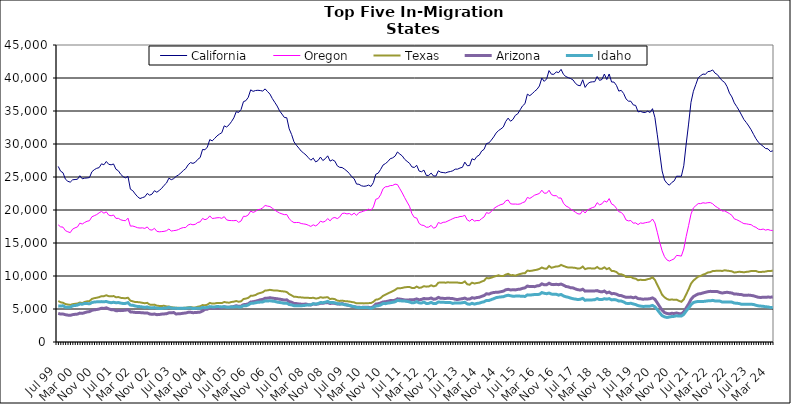
| Category |  California  |  Oregon  |  Texas  |  Arizona  |  Idaho  |
|---|---|---|---|---|---|
| Jul 99 | 26605 | 17749 | 6209 | 4339 | 5471 |
| Aug 99 | 25882 | 17447 | 6022 | 4228 | 5444 |
| Sep 99 | 25644 | 17401 | 5941 | 4237 | 5488 |
| Oct 99 | 24669 | 16875 | 5751 | 4134 | 5279 |
| Nov 99 | 24353 | 16701 | 5680 | 4073 | 5260 |
| Dec 99 | 24218 | 16570 | 5619 | 4042 | 5269 |
| Jan 00 | 24574 | 17109 | 5736 | 4142 | 5485 |
| Feb 00 | 24620 | 17295 | 5789 | 4192 | 5530 |
| Mar 00 | 24655 | 17436 | 5826 | 4226 | 5590 |
| Apr 00 | 25195 | 18009 | 5980 | 4375 | 5748 |
| May 00 | 24730 | 17875 | 5897 | 4337 | 5729 |
| Jun 00 | 24825 | 18113 | 6070 | 4444 | 5853 |
| Jul 00 | 24857 | 18294 | 6163 | 4555 | 5824 |
| Aug 00 | 24913 | 18376 | 6199 | 4603 | 5788 |
| Sep 00 | 25792 | 18971 | 6529 | 4804 | 5976 |
| Oct 00 | 26106 | 19135 | 6643 | 4870 | 6058 |
| Nov 00 | 26315 | 19306 | 6705 | 4926 | 6085 |
| Dec 00 | 26415 | 19570 | 6793 | 4991 | 6096 |
| Jan 01 | 26995 | 19781 | 6942 | 5122 | 6119 |
| Feb 01 | 26851 | 19519 | 6948 | 5089 | 6090 |
| Mar 01 | 27352 | 19720 | 7080 | 5180 | 6143 |
| Apr 01 | 26918 | 19221 | 6943 | 5020 | 6020 |
| May 01 | 26848 | 19126 | 6924 | 4899 | 5950 |
| Jun 01 | 26974 | 19241 | 6959 | 4895 | 6019 |
| Jul 01 | 26172 | 18725 | 6778 | 4737 | 5951 |
| Aug 01 | 25943 | 18736 | 6810 | 4757 | 5973 |
| Sep 01 | 25399 | 18514 | 6688 | 4753 | 5895 |
| Oct 01 | 25050 | 18415 | 6650 | 4780 | 5833 |
| Nov 01 | 24873 | 18381 | 6631 | 4826 | 5850 |
| Dec 01 | 25099 | 18765 | 6708 | 4898 | 5969 |
| Jan 02 | 23158 | 17561 | 6261 | 4560 | 5595 |
| Feb 02 | 22926 | 17573 | 6162 | 4531 | 5560 |
| Mar 02 | 22433 | 17452 | 6052 | 4481 | 5458 |
| Apr 02 | 22012 | 17314 | 6046 | 4458 | 5380 |
| May 02 | 21733 | 17267 | 6007 | 4452 | 5358 |
| Jun 02 | 21876 | 17298 | 5933 | 4444 | 5315 |
| Jul 02 | 21997 | 17209 | 5873 | 4383 | 5243 |
| Aug 02 | 22507 | 17436 | 5929 | 4407 | 5315 |
| Sep 02 | 22244 | 17010 | 5672 | 4248 | 5192 |
| Oct 02 | 22406 | 16952 | 5625 | 4191 | 5167 |
| Nov 02 | 22922 | 17223 | 5663 | 4242 | 5221 |
| Dec 02 | 22693 | 16770 | 5499 | 4142 | 5120 |
| Jan 03 | 22964 | 16694 | 5463 | 4166 | 5089 |
| Feb 03 | 23276 | 16727 | 5461 | 4226 | 5077 |
| Mar 03 | 23736 | 16766 | 5486 | 4251 | 5145 |
| Apr 03 | 24079 | 16859 | 5389 | 4289 | 5145 |
| May 03 | 24821 | 17117 | 5378 | 4415 | 5254 |
| Jun 03 | 24592 | 16812 | 5273 | 4426 | 5135 |
| Jul 03 | 24754 | 16875 | 5226 | 4466 | 5124 |
| Aug 03 | 25092 | 16922 | 5181 | 4244 | 5100 |
| Sep 03 | 25316 | 17036 | 5181 | 4279 | 5086 |
| Oct 03 | 25622 | 17228 | 5139 | 4301 | 5110 |
| Nov 03 | 25984 | 17335 | 5175 | 4362 | 5091 |
| Dec 03 | 26269 | 17350 | 5189 | 4396 | 5113 |
| Jan 04 | 26852 | 17734 | 5255 | 4492 | 5152 |
| Feb 04 | 27184 | 17860 | 5301 | 4502 | 5183 |
| Mar 04 | 27062 | 17757 | 5227 | 4443 | 5056 |
| Apr 04 | 27238 | 17840 | 5227 | 4461 | 5104 |
| May 04 | 27671 | 18113 | 5345 | 4493 | 5095 |
| Jun 04 | 27949 | 18201 | 5416 | 4532 | 5103 |
| Jul 04 | 29172 | 18727 | 5597 | 4697 | 5231 |
| Aug 04 | 29122 | 18529 | 5561 | 4945 | 5197 |
| Sep 04 | 29542 | 18678 | 5656 | 4976 | 5237 |
| Oct 04 | 30674 | 19108 | 5922 | 5188 | 5363 |
| Nov 04 | 30472 | 18716 | 5823 | 5106 | 5321 |
| Dec 04 | 30831 | 18755 | 5838 | 5135 | 5312 |
| Jan 05 | 31224 | 18823 | 5906 | 5155 | 5374 |
| Feb 05 | 31495 | 18842 | 5898 | 5168 | 5357 |
| Mar 05 | 31714 | 18738 | 5894 | 5212 | 5313 |
| Apr 05 | 32750 | 18998 | 6060 | 5340 | 5350 |
| May 05 | 32575 | 18504 | 5989 | 5269 | 5276 |
| Jun 05 | 32898 | 18414 | 5954 | 5252 | 5271 |
| Jul 05 | 33384 | 18395 | 6062 | 5322 | 5322 |
| Aug 05 | 33964 | 18381 | 6113 | 5375 | 5316 |
| Sep 05 | 34897 | 18426 | 6206 | 5493 | 5362 |
| Oct 05 | 34780 | 18132 | 6100 | 5408 | 5308 |
| Nov 05 | 35223 | 18332 | 6162 | 5434 | 5314 |
| Dec 05 | 36415 | 19047 | 6508 | 5658 | 5487 |
| Jan 06 | 36567 | 19032 | 6576 | 5688 | 5480 |
| Feb 06 | 37074 | 19257 | 6692 | 5792 | 5616 |
| Mar 06 | 38207 | 19845 | 6993 | 6052 | 5850 |
| Apr 06 | 37976 | 19637 | 7024 | 6101 | 5864 |
| May 06 | 38099 | 19781 | 7114 | 6178 | 5943 |
| Jun 06 | 38141 | 20061 | 7331 | 6276 | 6018 |
| Jul 06 | 38097 | 20111 | 7431 | 6399 | 6046 |
| Aug 06 | 38021 | 20333 | 7542 | 6450 | 6064 |
| Sep 06 | 38349 | 20686 | 7798 | 6627 | 6232 |
| Oct 06 | 37947 | 20591 | 7825 | 6647 | 6216 |
| Nov 06 | 37565 | 20526 | 7907 | 6707 | 6244 |
| Dec 06 | 36884 | 20272 | 7840 | 6648 | 6192 |
| Jan 07 | 36321 | 19984 | 7789 | 6597 | 6151 |
| Feb 07 | 35752 | 19752 | 7799 | 6554 | 6048 |
| Mar 07 | 35025 | 19547 | 7737 | 6487 | 5989 |
| Apr 07 | 34534 | 19412 | 7685 | 6430 | 5937 |
| May 07 | 34022 | 19296 | 7654 | 6353 | 5858 |
| Jun 07 | 33974 | 19318 | 7577 | 6390 | 5886 |
| Jul 07 | 32298 | 18677 | 7250 | 6117 | 5682 |
| Aug 07 | 31436 | 18322 | 7070 | 6034 | 5617 |
| Sep 07 | 30331 | 18087 | 6853 | 5847 | 5500 |
| Oct 07 | 29813 | 18108 | 6839 | 5821 | 5489 |
| Nov 07 | 29384 | 18105 | 6777 | 5769 | 5481 |
| Dec 07 | 28923 | 17949 | 6760 | 5733 | 5499 |
| Jan 08 | 28627 | 17890 | 6721 | 5732 | 5521 |
| Feb 08 | 28328 | 17834 | 6719 | 5749 | 5579 |
| Mar 08 | 27911 | 17680 | 6690 | 5650 | 5614 |
| Apr 08 | 27543 | 17512 | 6656 | 5612 | 5635 |
| May 08 | 27856 | 17754 | 6705 | 5774 | 5798 |
| Jun 08 | 27287 | 17589 | 6593 | 5717 | 5745 |
| Jul 08 | 27495 | 17834 | 6623 | 5761 | 5807 |
| Aug 08 | 28018 | 18309 | 6789 | 5867 | 5982 |
| Sep-08 | 27491 | 18164 | 6708 | 5864 | 5954 |
| Oct 08 | 27771 | 18291 | 6755 | 5942 | 6032 |
| Nov 08 | 28206 | 18706 | 6787 | 5970 | 6150 |
| Dec 08 | 27408 | 18353 | 6505 | 5832 | 5975 |
| Jan 09 | 27601 | 18778 | 6569 | 5890 | 5995 |
| Feb 09 | 27394 | 18863 | 6483 | 5845 | 5936 |
| Mar 09 | 26690 | 18694 | 6273 | 5751 | 5806 |
| Apr 09 | 26461 | 18943 | 6222 | 5735 | 5777 |
| May 09 | 26435 | 19470 | 6272 | 5819 | 5767 |
| Jun 09 | 26187 | 19522 | 6199 | 5700 | 5649 |
| Jul 09 | 25906 | 19408 | 6171 | 5603 | 5617 |
| Aug 09 | 25525 | 19469 | 6128 | 5533 | 5540 |
| Sep 09 | 25050 | 19249 | 6059 | 5405 | 5437 |
| Oct 09 | 24741 | 19529 | 6004 | 5349 | 5369 |
| Nov 09 | 23928 | 19187 | 5854 | 5271 | 5248 |
| Dec 09 | 23899 | 19607 | 5886 | 5261 | 5195 |
| Jan 10 | 23676 | 19703 | 5881 | 5232 | 5234 |
| Feb 10 | 23592 | 19845 | 5850 | 5272 | 5236 |
| Mar 10 | 23634 | 19946 | 5864 | 5278 | 5219 |
| Apr 10 | 23774 | 20134 | 5889 | 5257 | 5201 |
| May 10 | 23567 | 19966 | 5897 | 5172 | 5105 |
| Jun 10 | 24166 | 20464 | 6087 | 5356 | 5237 |
| Jul 10 | 25410 | 21627 | 6417 | 5742 | 5452 |
| Aug 10 | 25586 | 21744 | 6465 | 5797 | 5491 |
| Sep 10 | 26150 | 22314 | 6667 | 5907 | 5609 |
| Oct 10 | 26807 | 23219 | 6986 | 6070 | 5831 |
| Nov 10 | 27033 | 23520 | 7179 | 6100 | 5810 |
| Dec 10 | 27332 | 23551 | 7361 | 6182 | 5898 |
| Jan 11 | 27769 | 23697 | 7525 | 6276 | 5938 |
| Feb 11 | 27898 | 23718 | 7708 | 6267 | 6016 |
| Mar 11 | 28155 | 23921 | 7890 | 6330 | 6081 |
| Apr 11 | 28790 | 23847 | 8146 | 6544 | 6305 |
| May 11 | 28471 | 23215 | 8131 | 6502 | 6248 |
| Jun 11 | 28191 | 22580 | 8199 | 6445 | 6217 |
| Jul 11 | 27678 | 21867 | 8291 | 6368 | 6202 |
| Aug 11 | 27372 | 21203 | 8321 | 6356 | 6146 |
| Sep 11 | 27082 | 20570 | 8341 | 6387 | 6075 |
| Oct 11 | 26528 | 19442 | 8191 | 6402 | 5932 |
| Nov 11 | 26440 | 18872 | 8176 | 6426 | 5968 |
| Dec 11 | 26770 | 18784 | 8401 | 6533 | 6106 |
| Jan 12 | 25901 | 17963 | 8202 | 6390 | 5933 |
| Feb 12 | 25796 | 17718 | 8266 | 6456 | 5900 |
| Mar 12 | 26042 | 17647 | 8456 | 6600 | 6054 |
| Apr 12 | 25239 | 17386 | 8388 | 6534 | 5838 |
| May 12 | 25238 | 17407 | 8401 | 6558 | 5854 |
| Jun 12 | 25593 | 17673 | 8594 | 6669 | 6009 |
| Jul 12 | 25155 | 17237 | 8432 | 6474 | 5817 |
| Aug 12 | 25146 | 17391 | 8536 | 6539 | 5842 |
| Sep 12 | 25942 | 18102 | 8989 | 6759 | 6061 |
| Oct 12 | 25718 | 17953 | 9012 | 6618 | 6027 |
| Nov 12 | 25677 | 18134 | 9032 | 6611 | 6009 |
| Dec 12 | 25619 | 18166 | 8981 | 6601 | 5999 |
| Jan 13 | 25757 | 18344 | 9051 | 6627 | 5989 |
| Feb-13 | 25830 | 18512 | 9001 | 6606 | 5968 |
| Mar-13 | 25940 | 18689 | 9021 | 6577 | 5853 |
| Apr 13 | 26187 | 18844 | 9013 | 6478 | 5925 |
| May 13 | 26192 | 18884 | 9003 | 6431 | 5924 |
| Jun-13 | 26362 | 19013 | 8948 | 6508 | 5896 |
| Jul 13 | 26467 | 19037 | 8958 | 6559 | 5948 |
| Aug 13 | 27253 | 19198 | 9174 | 6655 | 6020 |
| Sep 13 | 26711 | 18501 | 8747 | 6489 | 5775 |
| Oct 13 | 26733 | 18301 | 8681 | 6511 | 5711 |
| Nov 13 | 27767 | 18620 | 8989 | 6709 | 5860 |
| Dec 13 | 27583 | 18320 | 8863 | 6637 | 5740 |
| Jan 14 | 28107 | 18409 | 8939 | 6735 | 5843 |
| Feb-14 | 28313 | 18383 | 8989 | 6779 | 5893 |
| Mar 14 | 28934 | 18696 | 9160 | 6918 | 6015 |
| Apr 14 | 29192 | 18946 | 9291 | 7036 | 6099 |
| May 14 | 30069 | 19603 | 9701 | 7314 | 6304 |
| Jun 14 | 30163 | 19487 | 9641 | 7252 | 6293 |
| Jul-14 | 30587 | 19754 | 9752 | 7415 | 6427 |
| Aug-14 | 31074 | 20201 | 9882 | 7499 | 6557 |
| Sep 14 | 31656 | 20459 | 9997 | 7536 | 6719 |
| Oct 14 | 32037 | 20663 | 10109 | 7555 | 6786 |
| Nov 14 | 32278 | 20825 | 9992 | 7628 | 6831 |
| Dec 14 | 32578 | 20918 | 10006 | 7705 | 6860 |
| Jan 15 | 33414 | 21396 | 10213 | 7906 | 7000 |
| Feb 15 | 33922 | 21518 | 10337 | 7982 | 7083 |
| Mar 15 | 33447 | 20942 | 10122 | 7891 | 7006 |
| Apr-15 | 33731 | 20893 | 10138 | 7906 | 6931 |
| May 15 | 34343 | 20902 | 10053 | 7895 | 6952 |
| Jun-15 | 34572 | 20870 | 10192 | 7973 | 6966 |
| Jul 15 | 35185 | 20916 | 10303 | 8000 | 6949 |
| Aug 15 | 35780 | 21115 | 10399 | 8126 | 6938 |
| Sep 15 | 36109 | 21246 | 10428 | 8207 | 6896 |
| Oct 15 | 37555 | 21908 | 10813 | 8477 | 7140 |
| Nov 15 | 37319 | 21750 | 10763 | 8390 | 7112 |
| Dec 15 | 37624 | 21990 | 10807 | 8395 | 7149 |
| Jan 16 | 37978 | 22248 | 10892 | 8388 | 7201 |
| Feb 16 | 38285 | 22369 | 10951 | 8508 | 7192 |
| Mar 16 | 38792 | 22506 | 11075 | 8547 | 7226 |
| Apr 16 | 39994 | 22999 | 11286 | 8815 | 7487 |
| May 16 | 39488 | 22548 | 11132 | 8673 | 7382 |
| Jun 16 | 39864 | 22556 | 11100 | 8682 | 7315 |
| Jul 16 | 41123 | 22989 | 11516 | 8903 | 7420 |
| Aug 16 | 40573 | 22333 | 11251 | 8731 | 7261 |
| Sep 16 | 40560 | 22162 | 11340 | 8692 | 7216 |
| Oct 16 | 40923 | 22172 | 11456 | 8742 | 7233 |
| Nov 16 | 40817 | 21818 | 11459 | 8685 | 7101 |
| Dec 16 | 41311 | 21815 | 11681 | 8783 | 7203 |
| Jan 17 | 40543 | 21029 | 11524 | 8609 | 6982 |
| Feb 17 | 40218 | 20613 | 11385 | 8416 | 6852 |
| Mar 17 | 40052 | 20425 | 11276 | 8354 | 6775 |
| Apr 17 | 39913 | 20147 | 11297 | 8218 | 6653 |
| May 17 | 39695 | 19910 | 11265 | 8196 | 6552 |
| Jun 17 | 39177 | 19650 | 11225 | 8034 | 6500 |
| Jul 17 | 38901 | 19419 | 11115 | 7923 | 6429 |
| Aug 17 | 38827 | 19389 | 11168 | 7867 | 6479 |
| Sep 17 | 39736 | 19936 | 11426 | 7991 | 6609 |
| Oct 17 | 38576 | 19547 | 11041 | 7708 | 6315 |
| Nov 17 | 39108 | 20013 | 11158 | 7746 | 6381 |
| Dec 17 | 39359 | 20202 | 11185 | 7743 | 6366 |
| Jan 18 | 39420 | 20362 | 11118 | 7736 | 6380 |
| Feb 18 | 39440 | 20476 | 11128 | 7741 | 6407 |
| Mar 18 | 40218 | 21106 | 11362 | 7789 | 6578 |
| Apr 18 | 39637 | 20788 | 11111 | 7642 | 6423 |
| May 18 | 39777 | 20933 | 11097 | 7591 | 6430 |
| Jun 18 | 40602 | 21381 | 11317 | 7721 | 6554 |
| Jul 18 | 39767 | 21189 | 11038 | 7445 | 6489 |
| Aug 18 | 40608 | 21729 | 11200 | 7560 | 6569 |
| Sep 18 | 39395 | 20916 | 10772 | 7318 | 6383 |
| Oct 18 | 39383 | 20724 | 10740 | 7344 | 6429 |
| Nov 18 | 38891 | 20265 | 10605 | 7255 | 6365 |
| Dec 18 | 38013 | 19741 | 10292 | 7069 | 6205 |
| Jan 19 | 38130 | 19643 | 10261 | 7032 | 6203 |
| Feb 19 | 37658 | 19237 | 10132 | 6892 | 6073 |
| Mar 19 | 36831 | 18492 | 9848 | 6766 | 5863 |
| Apr 19 | 36492 | 18349 | 9839 | 6763 | 5827 |
| May 19 | 36481 | 18407 | 9867 | 6809 | 5873 |
| Jun 19 | 35925 | 17998 | 9661 | 6698 | 5761 |
| Jul 19 | 35843 | 18049 | 9598 | 6800 | 5673 |
| Aug 19 | 34870 | 17785 | 9361 | 6577 | 5512 |
| Sep 19 | 34945 | 18038 | 9428 | 6547 | 5437 |
| Oct 19 | 34802 | 17977 | 9385 | 6483 | 5390 |
| Nov 19 | 34775 | 18072 | 9403 | 6511 | 5401 |
| Dec 19 | 34976 | 18140 | 9518 | 6521 | 5419 |
| Jan 20 | 34774 | 18209 | 9594 | 6561 | 5434 |
| Feb 20 | 35352 | 18632 | 9804 | 6682 | 5543 |
| Mar 20 | 34013 | 18041 | 9411 | 6464 | 5330 |
| Apr 20 | 31385 | 16629 | 8666 | 5922 | 4906 |
| May 20 | 28657 | 15123 | 7927 | 5355 | 4419 |
| Jun 20 | 25915 | 13817 | 7164 | 4815 | 3992 |
| Jul 20 | 24545 | 12926 | 6776 | 4457 | 3810 |
| Aug 20 | 24048 | 12443 | 6521 | 4326 | 3720 |
| Sep 20 | 23756 | 12258 | 6386 | 4266 | 3784 |
| Oct 20 | 24166 | 12429 | 6452 | 4347 | 3861 |
| Nov 20 | 24404 | 12597 | 6386 | 4324 | 3883 |
| Dec 20 | 25120 | 13122 | 6420 | 4394 | 3974 |
| Jan 21 | 25111 | 13080 | 6236 | 4304 | 3924 |
| Feb 21 | 25114 | 13015 | 6094 | 4260 | 3930 |
| Mar 21 | 26701 | 14096 | 6455 | 4567 | 4185 |
| Apr 21 | 29998 | 15978 | 7222 | 5164 | 4697 |
| May 21 | 33020 | 17641 | 7969 | 5748 | 5148 |
| Jun 21 | 36320 | 19369 | 8840 | 6450 | 5628 |
| Jul 21 | 37989 | 20320 | 9306 | 6877 | 5984 |
| Aug 21 | 39007 | 20657 | 9615 | 7094 | 6084 |
| Sep 21 | 40023 | 20974 | 9914 | 7277 | 6151 |
| Oct 21 | 40348 | 20966 | 10003 | 7327 | 6140 |
| Nov 21 | 40599 | 21096 | 10203 | 7437 | 6136 |
| Dec 21 | 40548 | 21032 | 10328 | 7532 | 6183 |
| Jan 22 | 40967 | 21106 | 10535 | 7618 | 6237 |
| Feb 22 | 41019 | 21125 | 10579 | 7673 | 6236 |
| Mar 22 | 41220 | 20949 | 10751 | 7660 | 6310 |
| Apr 22 | 40730 | 20602 | 10772 | 7661 | 6221 |
| May 22 | 40504 | 20370 | 10792 | 7636 | 6210 |
| Jun 22 | 40013 | 20127 | 10802 | 7504 | 6199 |
| Jul 22 | 39582 | 19846 | 10761 | 7419 | 6050 |
| Aug 22 | 39321 | 19865 | 10868 | 7487 | 6071 |
| Sep 22 | 38685 | 19666 | 10811 | 7536 | 6074 |
| Oct 22 | 37700 | 19450 | 10764 | 7469 | 6042 |
| Nov 22 | 37133 | 19198 | 10701 | 7425 | 6042 |
| Dec 22 | 36232 | 18659 | 10527 | 7261 | 5898 |
| Jan 23 | 35674 | 18528 | 10578 | 7263 | 5879 |
| Feb 23 | 35072 | 18344 | 10642 | 7211 | 5827 |
| Mar 23 | 34396 | 18133 | 10609 | 7183 | 5713 |
| Apr 23 | 33708 | 17931 | 10559 | 7074 | 5706 |
| May 23 | 33245 | 17904 | 10624 | 7091 | 5712 |
| Jun 23 | 32727 | 17831 | 10663 | 7105 | 5726 |
| Jul 23 | 32148 | 17773 | 10760 | 7058 | 5719 |
| Aug 23 | 31461 | 17513 | 10759 | 6999 | 5681 |
| Sep 23 | 30794 | 17376 | 10754 | 6882 | 5566 |
| Oct 23 | 30268 | 17096 | 10620 | 6775 | 5477 |
| Nov 23 | 29929 | 17029 | 10602 | 6746 | 5443 |
| Dec 23 | 29649 | 17114 | 10651 | 6787 | 5409 |
| Jan 24 | 29317 | 16951 | 10667 | 6765 | 5333 |
| Feb 24 | 29270 | 17045 | 10763 | 6813 | 5315 |
| Mar 24 | 28860 | 16919 | 10744 | 6786 | 5229 |
| Apr 24 | 28960 | 16905 | 10825 | 6832 | 5239 |